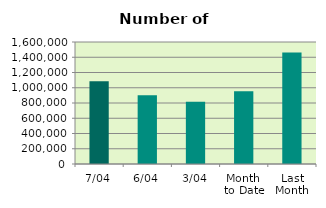
| Category | Series 0 |
|---|---|
| 7/04 | 1083932 |
| 6/04 | 900520 |
| 3/04 | 817132 |
| Month 
to Date | 955712.4 |
| Last
Month | 1462822.818 |